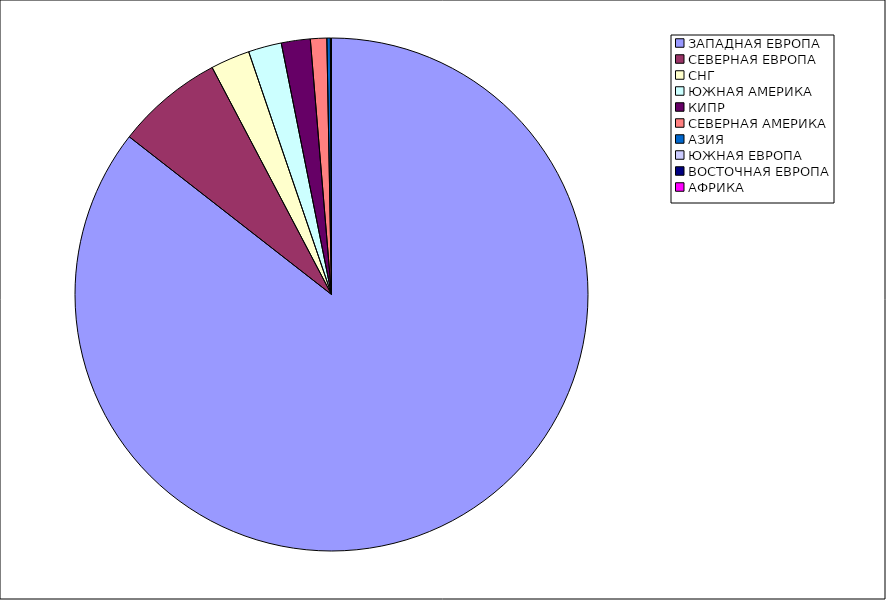
| Category | Оборот |
|---|---|
| ЗАПАДНАЯ ЕВРОПА | 0.855 |
| СЕВЕРНАЯ ЕВРОПА | 0.068 |
| СНГ | 0.025 |
| ЮЖНАЯ АМЕРИКА | 0.021 |
| КИПР | 0.018 |
| СЕВЕРНАЯ АМЕРИКА | 0.01 |
| АЗИЯ | 0.002 |
| ЮЖНАЯ ЕВРОПА | 0.001 |
| ВОСТОЧНАЯ ЕВРОПА | 0 |
| АФРИКА | 0 |